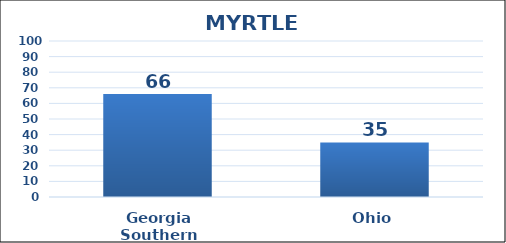
| Category | Series 0 |
|---|---|
| Georgia Southern | 66 |
| Ohio | 35 |